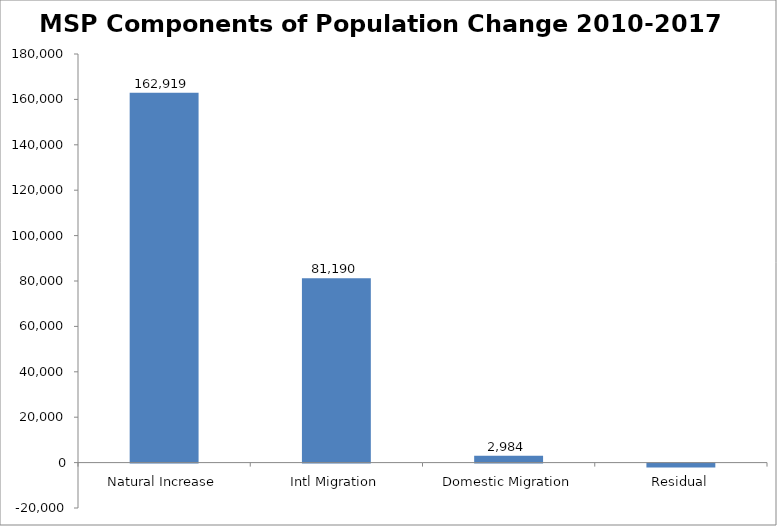
| Category | Series 0 |
|---|---|
| Natural Increase | 162919 |
| Intl Migration | 81190 |
| Domestic Migration | 2984 |
| Residual | -1671 |